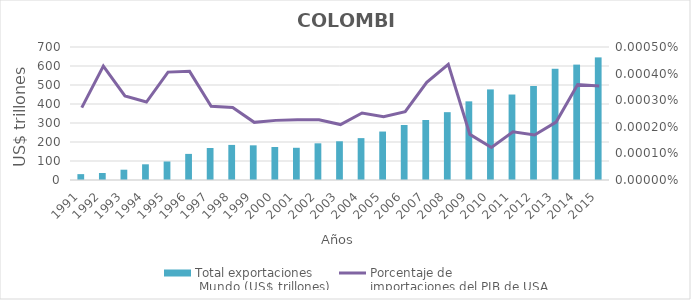
| Category | Total exportaciones
 Mundo (US$ trillones) |
|---|---|
| 1991.0 | 30.887 |
| 1992.0 | 36.749 |
| 1993.0 | 54.164 |
| 1994.0 | 82.614 |
| 1995.0 | 97.478 |
| 1996.0 | 137.405 |
| 1997.0 | 168.4 |
| 1998.0 | 184.644 |
| 1999.0 | 182.497 |
| 2000.0 | 173.838 |
| 2001.0 | 169.573 |
| 2002.0 | 193.084 |
| 2003.0 | 203.789 |
| 2004.0 | 220.416 |
| 2005.0 | 255.024 |
| 2006.0 | 289.63 |
| 2007.0 | 315.867 |
| 2008.0 | 356.995 |
| 2009.0 | 413.964 |
| 2010.0 | 476.729 |
| 2011.0 | 449.905 |
| 2012.0 | 494.708 |
| 2013.0 | 585.446 |
| 2014.0 | 607.309 |
| 2015.0 | 645.331 |